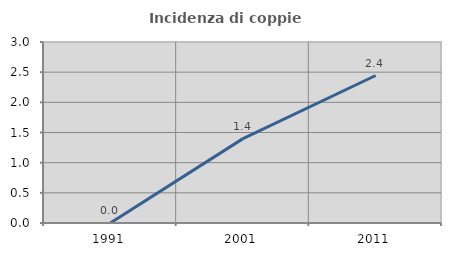
| Category | Incidenza di coppie miste |
|---|---|
| 1991.0 | 0 |
| 2001.0 | 1.399 |
| 2011.0 | 2.445 |